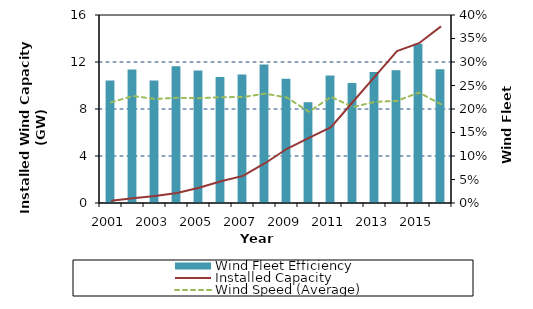
| Category | Wind Fleet Efficiency |
|---|---|
| 2001.0 | 0.261 |
| 2002.0 | 0.284 |
| 2003.0 | 0.261 |
| 2004.0 | 0.291 |
| 2005.0 | 0.282 |
| 2006.0 | 0.268 |
| 2007.0 | 0.273 |
| 2008.0 | 0.295 |
| 2009.0 | 0.264 |
| 2010.0 | 0.214 |
| 2011.0 | 0.271 |
| 2012.0 | 0.255 |
| 2013.0 | 0.279 |
| 2014.0 | 0.282 |
| 2015.0 | 0.339 |
| 2016.0 | 0.285 |